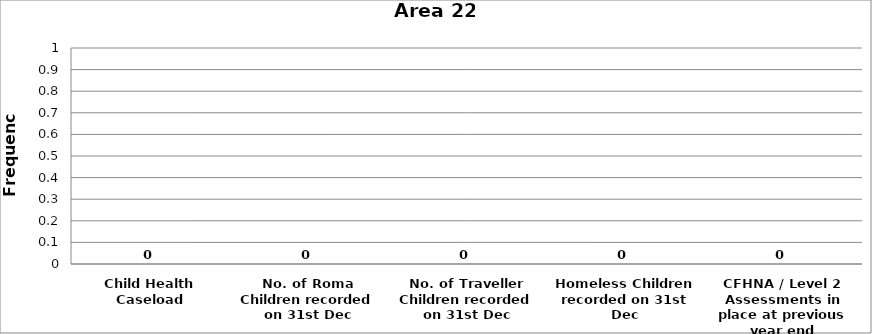
| Category | Area 22 |
|---|---|
| Child Health Caseload | 0 |
| No. of Roma Children recorded on 31st Dec | 0 |
| No. of Traveller Children recorded on 31st Dec | 0 |
| Homeless Children recorded on 31st Dec | 0 |
| CFHNA / Level 2 Assessments in place at previous year end | 0 |